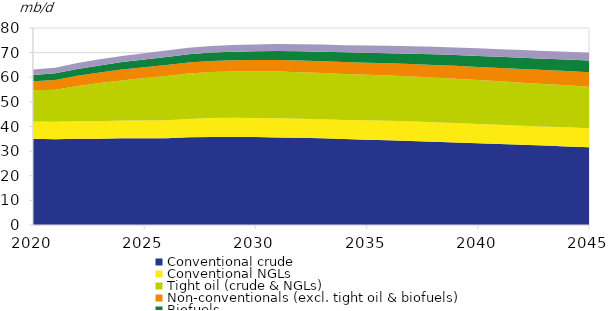
| Category | Conventional crude | Conventional NGLs | Tight oil (crude & NGLs) | Non-conventionals (excl. tight oil & biofuels) | Biofuels | Refinery processing gains |
|---|---|---|---|---|---|---|
| 2020-01-01 | 35.063 | 6.942 | 12.691 | 3.687 | 2.572 | 2.155 |
| 2021-01-01 | 34.869 | 7.017 | 13.012 | 4.021 | 2.685 | 2.287 |
| 2022-01-01 | 35.059 | 7.112 | 14.251 | 4.147 | 2.809 | 2.399 |
| 2023-01-01 | 35.071 | 7.096 | 15.466 | 4.247 | 2.932 | 2.469 |
| 2024-01-01 | 35.227 | 7.193 | 16.298 | 4.408 | 3.028 | 2.519 |
| 2025-01-01 | 35.198 | 7.224 | 17.232 | 4.449 | 3.119 | 2.573 |
| 2026-01-01 | 35.266 | 7.315 | 17.951 | 4.479 | 3.21 | 2.61 |
| 2027-01-01 | 35.598 | 7.493 | 18.399 | 4.509 | 3.302 | 2.66 |
| 2028-01-01 | 35.754 | 7.662 | 18.691 | 4.539 | 3.384 | 2.707 |
| 2029-01-01 | 35.771 | 7.746 | 18.825 | 4.56 | 3.467 | 2.752 |
| 2030-01-01 | 35.693 | 7.792 | 18.88 | 4.612 | 3.561 | 2.791 |
| 2031-01-01 | 35.553 | 7.795 | 18.976 | 4.671 | 3.653 | 2.827 |
| 2032-01-01 | 35.393 | 7.773 | 18.899 | 4.733 | 3.744 | 2.861 |
| 2033-01-01 | 35.187 | 7.784 | 18.766 | 4.789 | 3.835 | 2.892 |
| 2034-01-01 | 34.926 | 7.757 | 18.65 | 4.849 | 3.927 | 2.922 |
| 2035-01-01 | 34.666 | 7.824 | 18.5 | 4.913 | 4.018 | 2.951 |
| 2036-01-01 | 34.4 | 7.921 | 18.372 | 4.982 | 4.11 | 2.978 |
| 2037-01-01 | 34.148 | 7.938 | 18.208 | 5.055 | 4.201 | 3.005 |
| 2038-01-01 | 33.839 | 7.909 | 18.132 | 5.133 | 4.293 | 3.031 |
| 2039-01-01 | 33.526 | 7.879 | 18.015 | 5.217 | 4.384 | 3.056 |
| 2040-01-01 | 33.2 | 7.842 | 17.849 | 5.307 | 4.465 | 3.08 |
| 2041-01-01 | 32.885 | 7.793 | 17.69 | 5.407 | 4.516 | 3.104 |
| 2042-01-01 | 32.57 | 7.747 | 17.49 | 5.519 | 4.566 | 3.125 |
| 2043-01-01 | 32.248 | 7.731 | 17.307 | 5.639 | 4.617 | 3.146 |
| 2044-01-01 | 31.919 | 7.73 | 17.087 | 5.766 | 4.668 | 3.166 |
| 2045-01-01 | 31.584 | 7.694 | 16.856 | 5.902 | 4.719 | 3.184 |